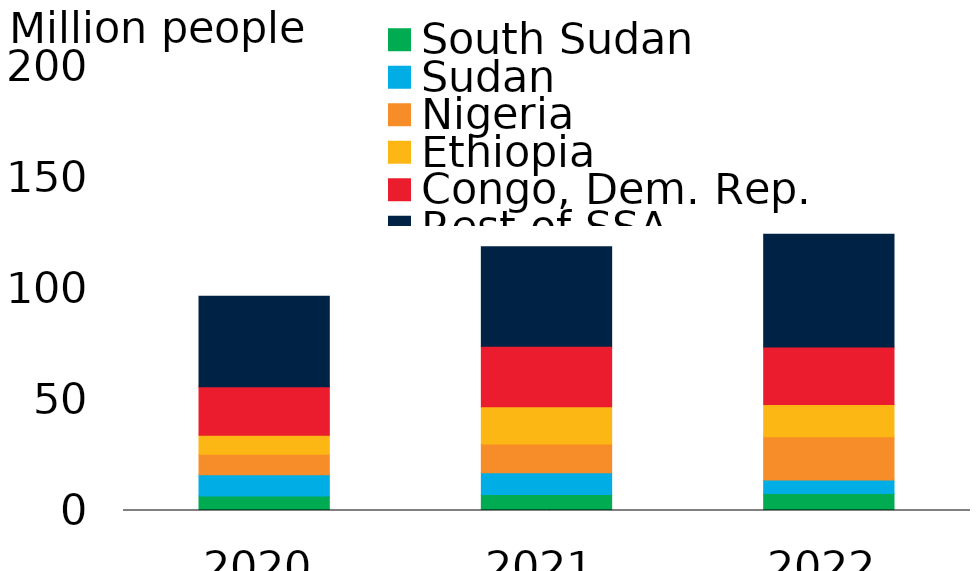
| Category | South Sudan | Sudan | Nigeria | Ethiopia | Congo, Dem. Rep. | Rest of SSA |
|---|---|---|---|---|---|---|
| 2020.0 | 6.5 | 9.6 | 9.2 | 8.6 | 21.8 | 40.8 |
| 2021.0 | 7.2 | 9.8 | 12.9 | 16.8 | 27.3 | 44.8 |
| 2022.0 | 7.7 | 6 | 19.5 | 14.5 | 25.9 | 50.8 |